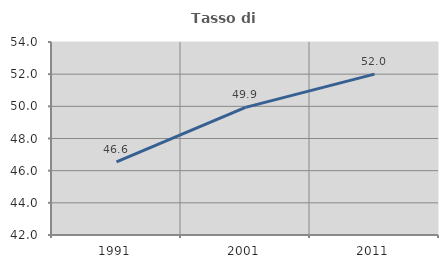
| Category | Tasso di occupazione   |
|---|---|
| 1991.0 | 46.551 |
| 2001.0 | 49.935 |
| 2011.0 | 52.005 |